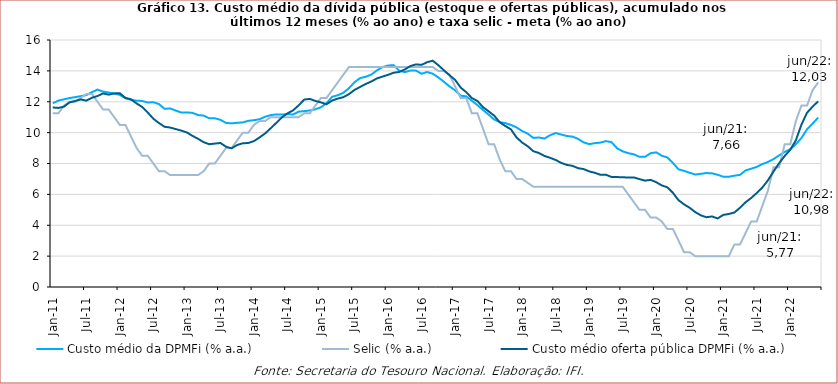
| Category | Custo médio da DPMFi (% a.a.) | Selic (% a.a.) | Custo médio oferta pública DPMFi (% a.a.) |
|---|---|---|---|
| 2011-01-31 | 11.9 | 11.25 | 11.63 |
| 2011-02-28 | 12.08 | 11.25 | 11.6 |
| 2011-03-31 | 12.155 | 11.75 | 11.68 |
| 2011-04-30 | 12.24 | 12 | 11.96 |
| 2011-05-31 | 12.3 | 12 | 12.05 |
| 2011-06-30 | 12.36 | 12.25 | 12.15 |
| 2011-07-31 | 12.43 | 12.5 | 12.07 |
| 2011-08-31 | 12.62 | 12.5 | 12.26 |
| 2011-09-30 | 12.79 | 12 | 12.37 |
| 2011-10-31 | 12.66 | 11.5 | 12.54 |
| 2011-11-30 | 12.6 | 11.5 | 12.46 |
| 2011-12-31 | 12.54 | 11 | 12.54 |
| 2012-01-31 | 12.44 | 10.5 | 12.55 |
| 2012-02-29 | 12.23 | 10.5 | 12.25 |
| 2012-03-31 | 12.12 | 9.75 | 12.16 |
| 2012-04-30 | 12.07 | 9 | 11.89 |
| 2012-05-31 | 12.05 | 8.5 | 11.66 |
| 2012-06-30 | 11.95 | 8.5 | 11.3 |
| 2012-07-31 | 11.97 | 8 | 10.9 |
| 2012-08-31 | 11.85 | 7.5 | 10.62 |
| 2012-09-30 | 11.54 | 7.5 | 10.38 |
| 2012-10-31 | 11.57 | 7.25 | 10.33 |
| 2012-11-30 | 11.43 | 7.25 | 10.23 |
| 2012-12-31 | 11.3 | 7.25 | 10.13 |
| 2013-01-31 | 11.31 | 7.25 | 10.01 |
| 2013-02-28 | 11.28 | 7.25 | 9.79 |
| 2013-03-31 | 11.14 | 7.25 | 9.6 |
| 2013-04-30 | 11.1 | 7.5 | 9.38 |
| 2013-05-31 | 10.93 | 8 | 9.25 |
| 2013-06-30 | 10.93 | 8 | 9.29 |
| 2013-07-31 | 10.83 | 8.5 | 9.33 |
| 2013-08-31 | 10.63 | 9 | 9.09 |
| 2013-09-30 | 10.6 | 9 | 8.98 |
| 2013-10-31 | 10.637 | 9.5 | 9.2 |
| 2013-11-30 | 10.663 | 10 | 9.31 |
| 2013-12-31 | 10.763 | 10 | 9.33 |
| 2014-01-31 | 10.805 | 10.5 | 9.449 |
| 2014-02-28 | 10.867 | 10.75 | 9.686 |
| 2014-03-31 | 11.027 | 10.75 | 9.946 |
| 2014-04-30 | 11.131 | 11 | 10.282 |
| 2014-05-31 | 11.182 | 11 | 10.629 |
| 2014-06-30 | 11.173 | 11 | 10.991 |
| 2014-07-31 | 11.197 | 11 | 11.246 |
| 2014-08-31 | 11.175 | 11 | 11.439 |
| 2014-09-30 | 11.356 | 11 | 11.764 |
| 2014-10-31 | 11.391 | 11.25 | 12.14 |
| 2014-11-30 | 11.435 | 11.25 | 12.187 |
| 2014-12-31 | 11.512 | 11.75 | 12.053 |
| 2015-01-31 | 11.643 | 12.25 | 11.956 |
| 2015-02-27 | 11.909 | 12.25 | 11.84 |
| 2015-03-31 | 12.323 | 12.75 | 12.08 |
| 2015-04-30 | 12.419 | 13.25 | 12.204 |
| 2015-05-31 | 12.579 | 13.75 | 12.297 |
| 2015-06-30 | 12.877 | 14.25 | 12.491 |
| 2015-07-31 | 13.263 | 14.25 | 12.765 |
| 2015-08-31 | 13.532 | 14.25 | 12.96 |
| 2015-09-30 | 13.618 | 14.25 | 13.15 |
| 2015-10-31 | 13.754 | 14.25 | 13.31 |
| 2015-11-30 | 14.029 | 14.25 | 13.51 |
| 2015-12-31 | 14.241 | 14.25 | 13.63 |
| 2016-01-31 | 14.346 | 14.25 | 13.74 |
| 2016-02-29 | 14.372 | 14.25 | 13.88 |
| 2016-03-31 | 14.015 | 14.25 | 13.93 |
| 2016-04-30 | 13.92 | 14.25 | 14.09 |
| 2016-05-31 | 14.016 | 14.25 | 14.31 |
| 2016-06-30 | 14.017 | 14.25 | 14.42 |
| 2016-07-31 | 13.814 | 14.25 | 14.39 |
| 2016-08-31 | 13.924 | 14.25 | 14.56 |
| 2016-09-30 | 13.82 | 14.25 | 14.66 |
| 2016-10-31 | 13.578 | 14 | 14.37 |
| 2016-11-30 | 13.296 | 14 | 14.04 |
| 2016-12-31 | 12.996 | 13.75 | 13.72 |
| 2017-01-31 | 12.739 | 13 | 13.42 |
| 2017-02-28 | 12.394 | 12.25 | 12.92 |
| 2017-03-31 | 12.351 | 12.25 | 12.62 |
| 2017-04-30 | 12.068 | 11.25 | 12.24 |
| 2017-05-31 | 11.784 | 11.25 | 12.05 |
| 2017-06-30 | 11.466 | 10.25 | 11.65 |
| 2017-07-31 | 11.168 | 9.25 | 11.38 |
| 2017-08-31 | 10.85 | 9.25 | 11.1 |
| 2017-09-30 | 10.68 | 8.25 | 10.67 |
| 2017-10-31 | 10.617 | 7.5 | 10.43 |
| 2017-11-30 | 10.498 | 7.5 | 10.21 |
| 2017-12-31 | 10.339 | 7 | 9.69 |
| 2018-01-31 | 10.104 | 7 | 9.36 |
| 2018-02-28 | 9.934 | 6.75 | 9.12 |
| 2018-03-31 | 9.659 | 6.5 | 8.8 |
| 2018-04-30 | 9.686 | 6.5 | 8.68 |
| 2018-05-31 | 9.617 | 6.5 | 8.49 |
| 2018-06-30 | 9.83 | 6.5 | 8.37 |
| 2018-07-31 | 9.971 | 6.5 | 8.23 |
| 2018-08-31 | 9.878 | 6.5 | 8.04 |
| 2018-09-30 | 9.78 | 6.5 | 7.91 |
| 2018-10-31 | 9.743 | 6.5 | 7.85 |
| 2018-11-30 | 9.6 | 6.5 | 7.7 |
| 2018-12-31 | 9.371 | 6.5 | 7.64 |
| 2019-01-31 | 9.254 | 6.5 | 7.49 |
| 2019-02-28 | 9.318 | 6.5 | 7.4 |
| 2019-03-31 | 9.355 | 6.5 | 7.27 |
| 2019-04-30 | 9.449 | 6.5 | 7.27 |
| 2019-05-31 | 9.385 | 6.5 | 7.13 |
| 2019-06-30 | 8.987 | 6.5 | 7.12 |
| 2019-07-31 | 8.788 | 6.5 | 7.11 |
| 2019-08-31 | 8.669 | 6 | 7.09 |
| 2019-09-30 | 8.594 | 5.5 | 7.1 |
| 2019-10-31 | 8.431 | 5 | 6.99 |
| 2019-11-30 | 8.435 | 5 | 6.89 |
| 2019-12-31 | 8.665 | 4.5 | 6.94 |
| 2020-01-31 | 8.723 | 4.5 | 6.79 |
| 2020-02-29 | 8.505 | 4.25 | 6.58 |
| 2020-03-31 | 8.392 | 3.75 | 6.46 |
| 2020-04-30 | 8.031 | 3.75 | 6.1 |
| 2020-05-31 | 7.621 | 3 | 5.62 |
| 2020-06-30 | 7.524 | 2.25 | 5.35 |
| 2020-07-31 | 7.398 | 2.25 | 5.13 |
| 2020-08-31 | 7.286 | 2 | 4.85 |
| 2020-09-30 | 7.331 | 2 | 4.64 |
| 2020-10-31 | 7.381 | 2 | 4.52 |
| 2020-11-30 | 7.365 | 2 | 4.57 |
| 2020-12-31 | 7.269 | 2 | 4.44 |
| 2021-01-31 | 7.146 | 2 | 4.67 |
| 2021-02-28 | 7.146 | 2 | 4.73 |
| 2021-03-31 | 7.21 | 2.75 | 4.827 |
| 2021-04-30 | 7.263 | 2.75 | 5.134 |
| 2021-05-31 | 7.552 | 3.5 | 5.488 |
| 2021-06-30 | 7.662 | 4.25 | 5.765 |
| 2021-07-31 | 7.779 | 4.25 | 6.089 |
| 2021-08-31 | 7.96 | 5.25 | 6.441 |
| 2021-09-30 | 8.099 | 6.25 | 6.909 |
| 2021-10-31 | 8.285 | 7.75 | 7.478 |
| 2021-11-30 | 8.523 | 7.75 | 8.018 |
| 2021-12-31 | 8.749 | 9.25 | 8.486 |
| 2022-01-31 | 8.922 | 9.25 | 8.896 |
| 2022-02-28 | 9.248 | 10.75 | 9.503 |
| 2022-03-31 | 9.652 | 11.75 | 10.519 |
| 2022-04-30 | 10.216 | 11.75 | 11.288 |
| 2022-05-31 | 10.585 | 12.75 | 11.688 |
| 2022-06-30 | 10.979 | 13.25 | 12.028 |